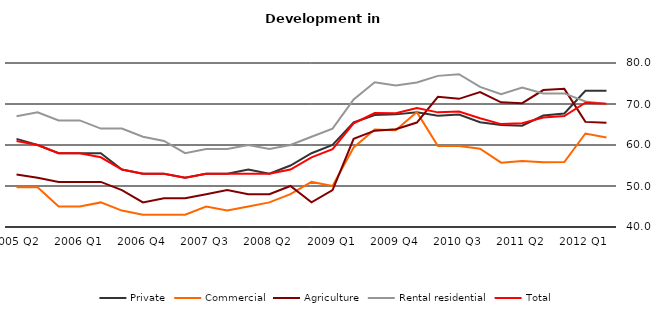
| Category | Private | Commercial | Agriculture | Rental residential | Total |
|---|---|---|---|---|---|
| 2005 Q2 | 61.5 | 49.7 | 52.8 | 67 | 61 |
| 2005 Q3 | 60 | 49.7 | 52 | 68 | 60 |
| 2005 Q4 | 58 | 45 | 51 | 66 | 58 |
| 2006 Q1 | 58 | 45 | 51 | 66 | 58 |
| 2006 Q2 | 58 | 46 | 51 | 64 | 57 |
| 2006 Q3 | 54 | 44 | 49 | 64 | 54 |
| 2006 Q4 | 53 | 43 | 46 | 62 | 53 |
| 2007 Q1 | 53 | 43 | 47 | 61 | 53 |
| 2007 Q2 | 52 | 43 | 47 | 58 | 52 |
| 2007 Q3 | 53 | 45 | 48 | 59 | 53 |
| 2007 Q4 | 53 | 44 | 49 | 59 | 53 |
| 2008 Q1 | 54 | 45 | 48 | 60 | 53 |
| 2008 Q2 | 53 | 46 | 48 | 59 | 53 |
| 2008 Q3 | 55 | 48 | 50 | 60 | 54 |
| 2008 Q4 | 58 | 51 | 46 | 62 | 57 |
| 2009 Q1 | 60 | 50 | 49 | 64 | 59 |
| 2009 Q2 | 65.5 | 59.4 | 61.5 | 71.1 | 65.3 |
| 2009 Q3 | 67.3 | 63.8 | 63.5 | 75.3 | 67.8 |
| 2009 Q4 | 67.47 | 63.58 | 63.86 | 74.51 | 67.77 |
| 2010 Q1 | 67.97 | 68.02 | 65.48 | 75.24 | 69.01 |
| 2010 Q2 | 67.16 | 59.75 | 71.77 | 76.86 | 67.96 |
| 2010 Q3 | 67.45 | 59.73 | 71.26 | 77.27 | 68.16 |
| 2010 Q4 | 65.57 | 59.11 | 72.9 | 74.19 | 66.53 |
| 2011 Q1 | 64.9 | 55.7 | 70.4 | 72.4 | 65.1 |
| 2011 Q2 | 64.7 | 56.1 | 70.2 | 74 | 65.3 |
| 2011 Q3 | 67.18 | 55.81 | 73.4 | 72.58 | 66.7 |
| 2011 Q4 | 67.69 | 55.86 | 73.69 | 72.59 | 67.06 |
| 2012 Q1 | 73.22 | 62.81 | 65.64 | 70.6 | 70.32 |
| 2012 Q2 | 73.22 | 61.82 | 65.42 | 70 | 70.05 |